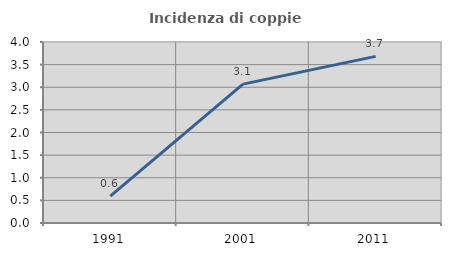
| Category | Incidenza di coppie miste |
|---|---|
| 1991.0 | 0.595 |
| 2001.0 | 3.069 |
| 2011.0 | 3.682 |